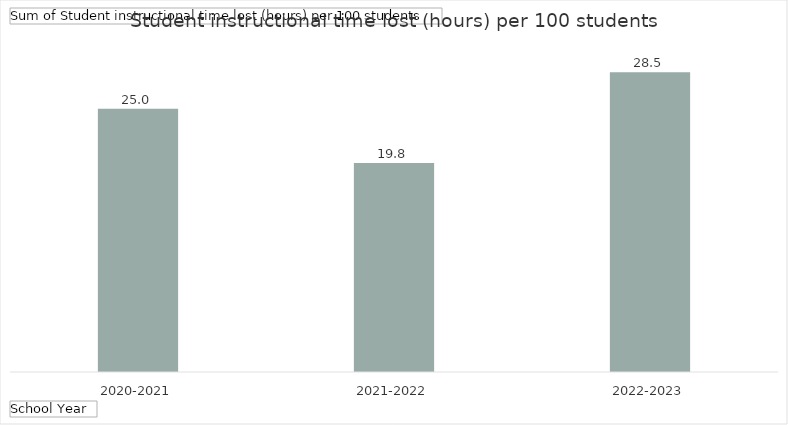
| Category | Total |
|---|---|
| 2020-2021 | 25 |
| 2021-2022 | 19.841 |
| 2022-2023 | 28.455 |